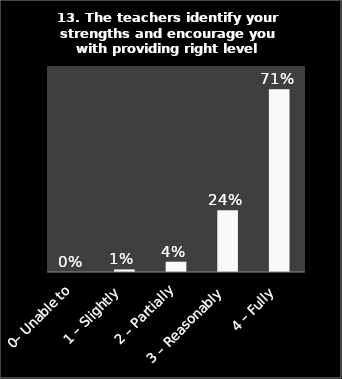
| Category | Series 0 |
|---|---|
| 0– Unable to | 0 |
| 1 – Slightly | 0.01 |
| 2 – Partially | 0.04 |
| 3 – Reasonably | 0.24 |
| 4 – Fully | 0.71 |